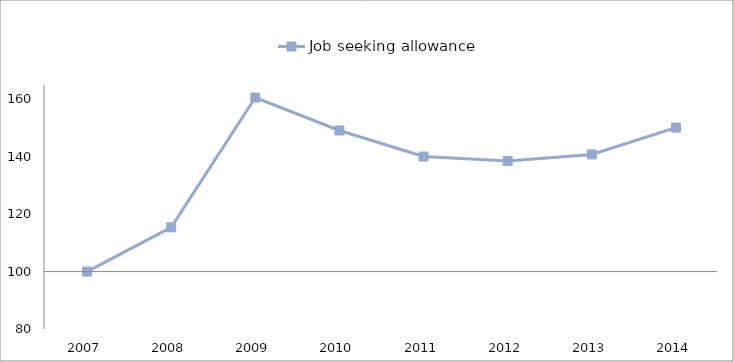
| Category | Job seeking allowance | 0 |
|---|---|---|
| 2007.0 | 100 |  |
| 2008.0 | 115.426 |  |
| 2009.0 | 160.628 |  |
| 2010.0 | 149.145 |  |
| 2011.0 | 140.077 |  |
| 2012.0 | 138.559 |  |
| 2013.0 | 140.815 |  |
| 2014.0 | 150.163 |  |